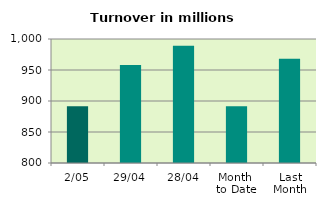
| Category | Series 0 |
|---|---|
| 2/05 | 891.706 |
| 29/04 | 958.055 |
| 28/04 | 989.285 |
| Month 
to Date | 891.706 |
| Last
Month | 968.247 |